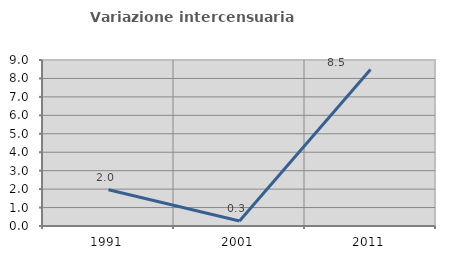
| Category | Variazione intercensuaria annua |
|---|---|
| 1991.0 | 1.965 |
| 2001.0 | 0.273 |
| 2011.0 | 8.486 |